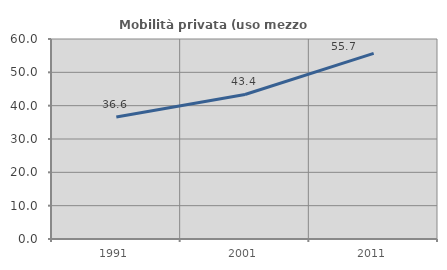
| Category | Mobilità privata (uso mezzo privato) |
|---|---|
| 1991.0 | 36.576 |
| 2001.0 | 43.351 |
| 2011.0 | 55.67 |